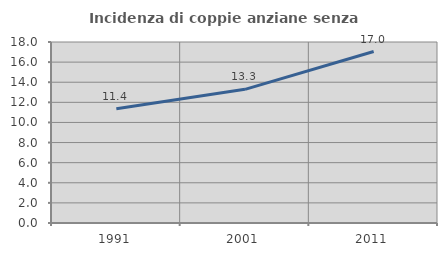
| Category | Incidenza di coppie anziane senza figli  |
|---|---|
| 1991.0 | 11.371 |
| 2001.0 | 13.291 |
| 2011.0 | 17.049 |